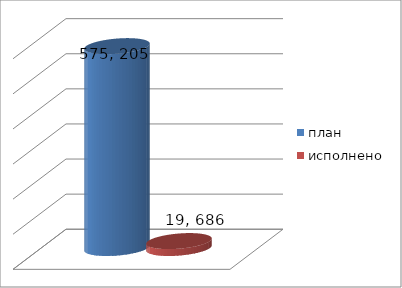
| Category | план | исполнено |
|---|---|---|
| 0 | 575205341.66 | 19686504.02 |